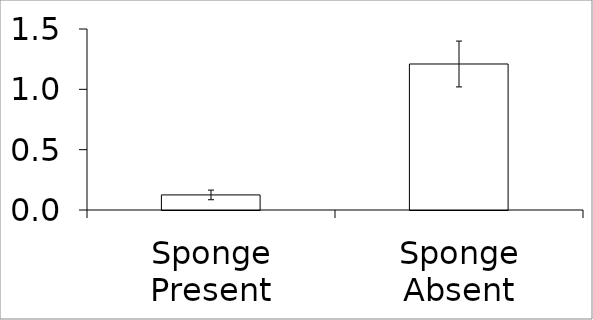
| Category | Series 0 |
|---|---|
| Sponge Present | 0.125 |
| Sponge Absent | 1.21 |